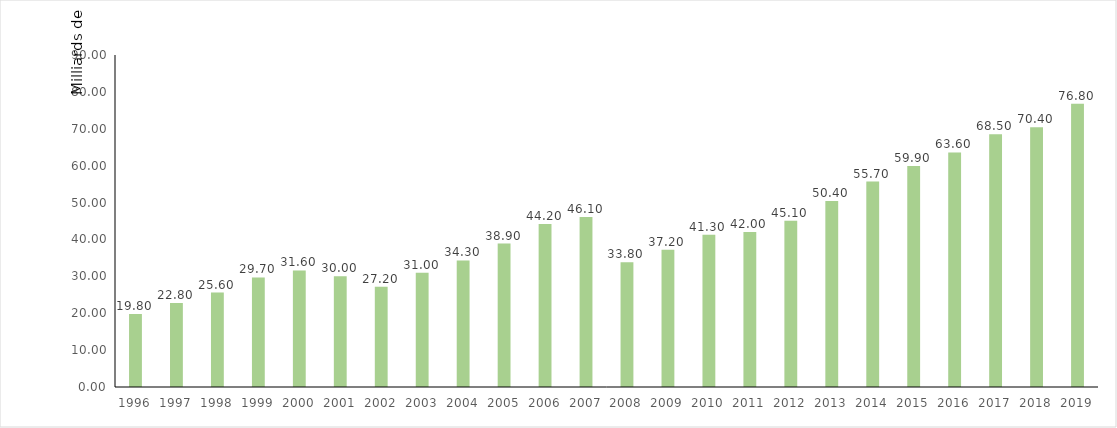
| Category | Mds $ |
|---|---|
| 1996.0 | 19.8 |
| 1997.0 | 22.8 |
| 1998.0 | 25.6 |
| 1999.0 | 29.7 |
| 2000.0 | 31.6 |
| 2001.0 | 30 |
| 2002.0 | 27.2 |
| 2003.0 | 31 |
| 2004.0 | 34.3 |
| 2005.0 | 38.9 |
| 2006.0 | 44.2 |
| 2007.0 | 46.1 |
| 2008.0 | 33.8 |
| 2009.0 | 37.2 |
| 2010.0 | 41.3 |
| 2011.0 | 42 |
| 2012.0 | 45.1 |
| 2013.0 | 50.4 |
| 2014.0 | 55.7 |
| 2015.0 | 59.9 |
| 2016.0 | 63.6 |
| 2017.0 | 68.5 |
| 2018.0 | 70.4 |
| 2019.0 | 76.8 |